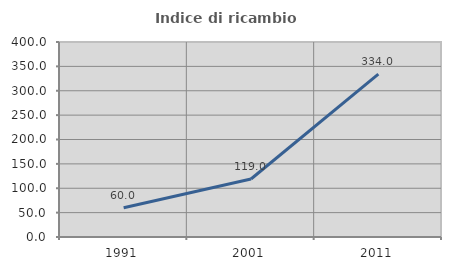
| Category | Indice di ricambio occupazionale  |
|---|---|
| 1991.0 | 60 |
| 2001.0 | 118.966 |
| 2011.0 | 334 |